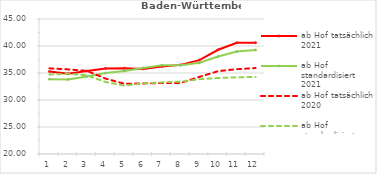
| Category | ab Hof tatsächlich 2021 | ab Hof standardisiert 2021 | ab Hof tatsächlich 2020 | ab Hof standardisiert 2020 |
|---|---|---|---|---|
| 0 | 35.278 | 33.842 | 35.86 | 34.723 |
| 1 | 34.871 | 33.816 | 35.667 | 34.855 |
| 2 | 35.366 | 34.36 | 35.392 | 34.576 |
| 3 | 35.853 | 35.002 | 33.965 | 33.332 |
| 4 | 35.876 | 35.367 | 33.005 | 32.681 |
| 5 | 35.753 | 35.938 | 33.07 | 33.065 |
| 6 | 36.2 | 36.416 | 33.139 | 33.265 |
| 7 | 36.504 | 36.44 | 33.163 | 33.402 |
| 8 | 37.389 | 36.896 | 34.274 | 33.853 |
| 9 | 39.305 | 38.049 | 35.349 | 34.077 |
| 10 | 40.612 | 38.987 | 35.707 | 34.201 |
| 11 | 40.609 | 39.26 | 35.921 | 34.274 |